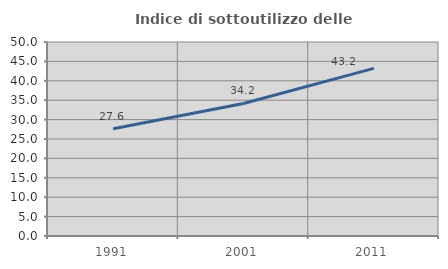
| Category | Indice di sottoutilizzo delle abitazioni  |
|---|---|
| 1991.0 | 27.622 |
| 2001.0 | 34.158 |
| 2011.0 | 43.193 |